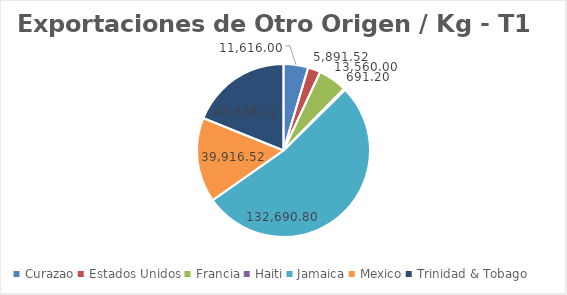
| Category | kg |
|---|---|
| Curazao | 11616 |
| Estados Unidos | 5891.52 |
| Francia | 13560 |
| Haiti | 691.2 |
| Jamaica | 132690.8 |
| Mexico | 39916.52 |
| Trinidad & Tobago | 47638.22 |